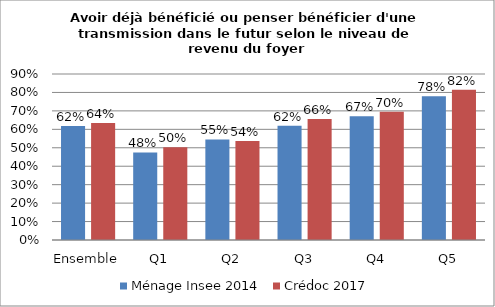
| Category | Ménage Insee 2014 | Crédoc 2017 |
|---|---|---|
| Ensemble | 0.618 | 0.635 |
| Q1 | 0.475 | 0.503 |
| Q2 | 0.545 | 0.537 |
| Q3 | 0.62 | 0.656 |
| Q4 | 0.671 | 0.695 |
| Q5 | 0.78 | 0.815 |